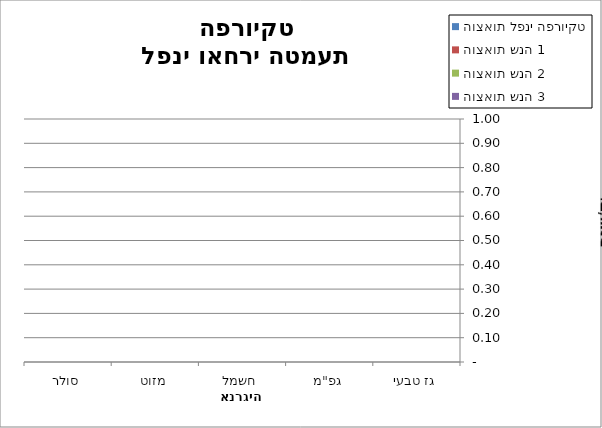
| Category | הוצאות לפני הפרויקט | הוצאות שנה 1 | הוצאות שנה 2 | הוצאות שנה 3 |
|---|---|---|---|---|
| גז טבעי | 0 | 0 | 0 | 0 |
| גפ"מ | 0 | 0 | 0 | 0 |
| חשמל | 0 | 0 | 0 | 0 |
| מזוט | 0 | 0 | 0 | 0 |
| סולר | 0 | 0 | 0 | 0 |